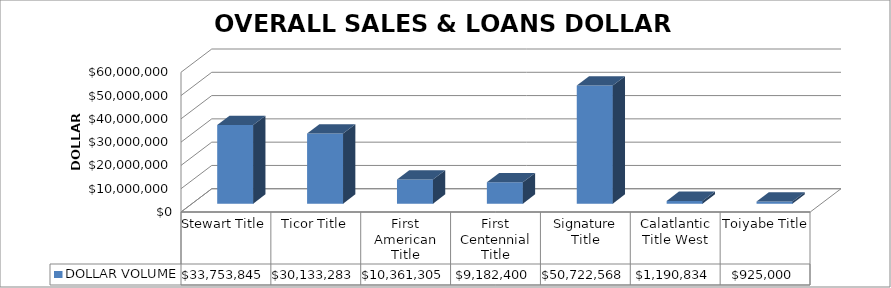
| Category | DOLLAR VOLUME |
|---|---|
| Stewart Title | 33753845 |
| Ticor Title | 30133283 |
| First American Title | 10361305 |
| First Centennial Title | 9182400 |
| Signature Title | 50722568 |
| Calatlantic Title West | 1190834 |
| Toiyabe Title | 925000 |